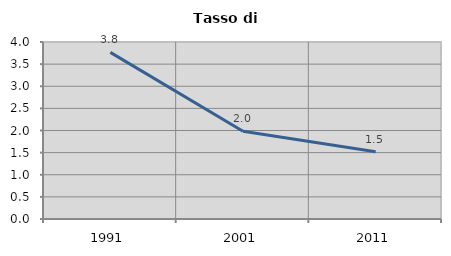
| Category | Tasso di disoccupazione   |
|---|---|
| 1991.0 | 3.765 |
| 2001.0 | 1.983 |
| 2011.0 | 1.52 |